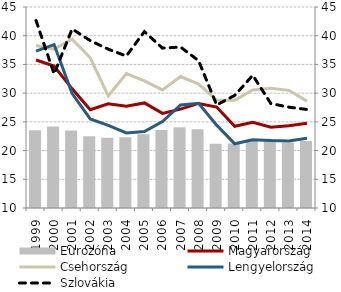
| Category | Eurozóna |
|---|---|
| 1999 | 23.52 |
| 2000 | 24.18 |
| 2001 | 23.51 |
| 2002 | 22.51 |
| 2003 | 22.22 |
| 2004 | 22.32 |
| 2005 | 22.84 |
| 2006 | 23.6 |
| 2007 | 24.08 |
| 2008 | 23.72 |
| 2009 | 21.17 |
| 2010 | 21.21 |
| 2011 | 21.93 |
| 2012 | 21.98 |
| 2013 | 21.41 |
| 2014 | 21.68 |